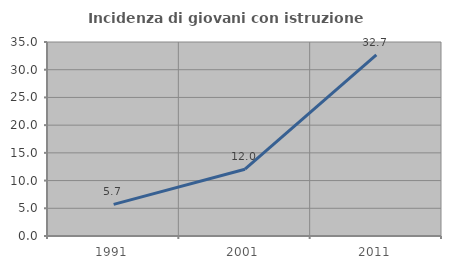
| Category | Incidenza di giovani con istruzione universitaria |
|---|---|
| 1991.0 | 5.699 |
| 2001.0 | 12.048 |
| 2011.0 | 32.692 |